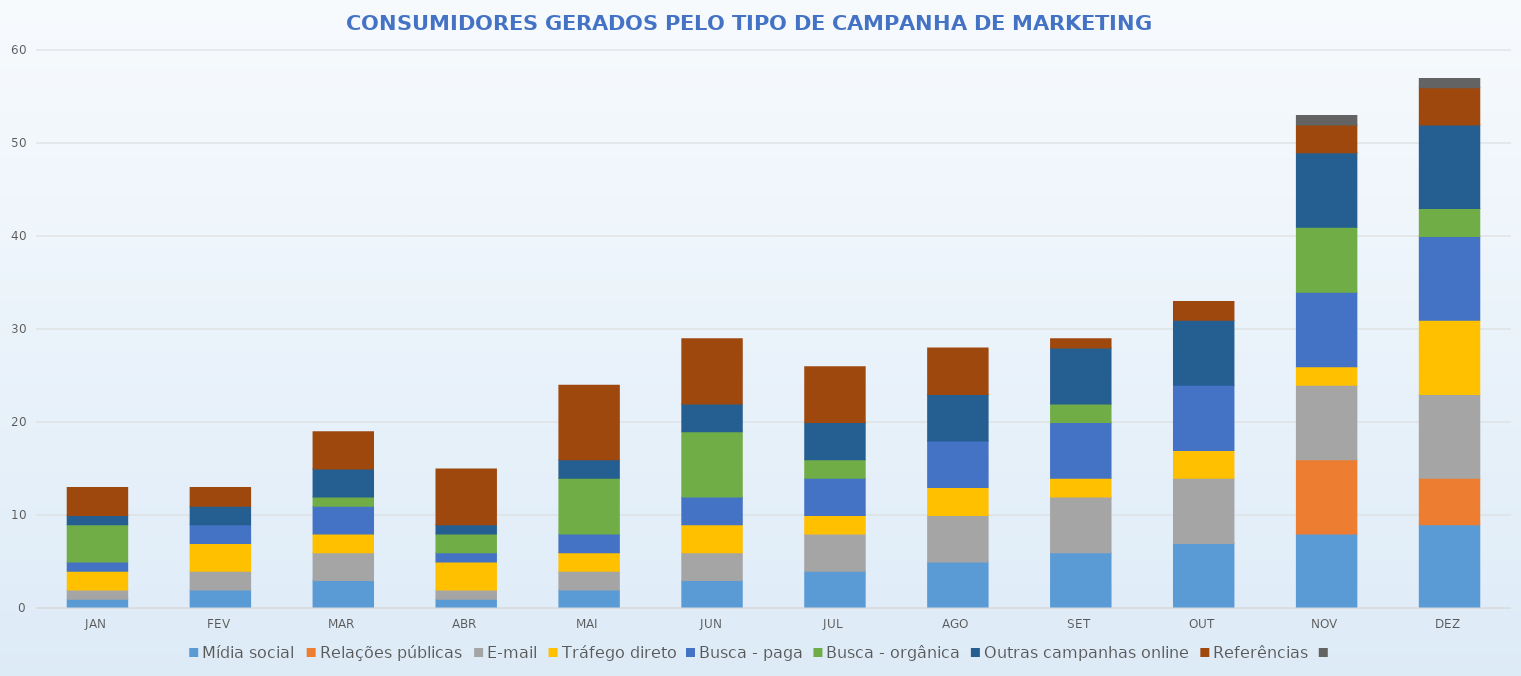
| Category | Mídia social | Relações públicas | E-mail | Tráfego direto | Busca - paga | Busca - orgânica | Outras campanhas online | Referências | Series 8 |
|---|---|---|---|---|---|---|---|---|---|
| JAN | 1 | 0 | 1 | 2 | 1 | 4 | 1 | 3 | 0 |
| FEV | 2 | 0 | 2 | 3 | 2 | 0 | 2 | 2 | 0 |
| MAR | 3 | 0 | 3 | 2 | 3 | 1 | 3 | 4 | 0 |
| ABR | 1 | 0 | 1 | 3 | 1 | 2 | 1 | 6 | 0 |
| MAI | 2 | 0 | 2 | 2 | 2 | 6 | 2 | 8 | 0 |
| JUN | 3 | 0 | 3 | 3 | 3 | 7 | 3 | 7 | 0 |
| JUL | 4 | 0 | 4 | 2 | 4 | 2 | 4 | 6 | 0 |
| AGO | 5 | 0 | 5 | 3 | 5 | 0 | 5 | 5 | 0 |
| SET | 6 | 0 | 6 | 2 | 6 | 2 | 6 | 1 | 0 |
| OUT | 7 | 0 | 7 | 3 | 7 | 0 | 7 | 2 | 0 |
| NOV | 8 | 8 | 8 | 2 | 8 | 7 | 8 | 3 | 1 |
| DEZ | 9 | 5 | 9 | 8 | 9 | 3 | 9 | 4 | 1 |